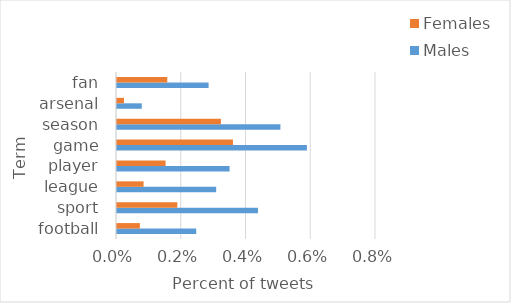
| Category | Males | Females |
|---|---|---|
| football | 0.002 | 0.001 |
| sport | 0.004 | 0.002 |
| league | 0.003 | 0.001 |
| player | 0.003 | 0.002 |
| game | 0.006 | 0.004 |
| season | 0.005 | 0.003 |
| arsenal | 0.001 | 0 |
| fan | 0.003 | 0.002 |